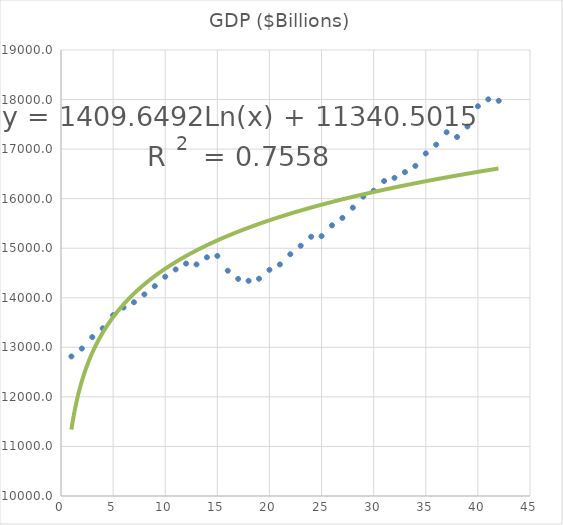
| Category | GDP ($Billions) |
|---|---|
| 1.0 | 12816.2 |
| 2.0 | 12975.7 |
| 3.0 | 13206.5 |
| 4.0 | 13383.3 |
| 5.0 | 13649.8 |
| 6.0 | 13802.9 |
| 7.0 | 13910.5 |
| 8.0 | 14068.4 |
| 9.0 | 14235 |
| 10.0 | 14424.5 |
| 11.0 | 14571.9 |
| 12.0 | 14690 |
| 13.0 | 14672.9 |
| 14.0 | 14817.1 |
| 15.0 | 14844.3 |
| 16.0 | 14546.7 |
| 17.0 | 14381.2 |
| 18.0 | 14342.1 |
| 19.0 | 14384.4 |
| 20.0 | 14564.1 |
| 21.0 | 14672.5 |
| 22.0 | 14879.2 |
| 23.0 | 15049.8 |
| 24.0 | 15231.7 |
| 25.0 | 15242.9 |
| 26.0 | 15461.9 |
| 27.0 | 15611.8 |
| 28.0 | 15818.7 |
| 29.0 | 16041.6 |
| 30.0 | 16160.4 |
| 31.0 | 16356 |
| 32.0 | 16420.3 |
| 33.0 | 16535.3 |
| 34.0 | 16661 |
| 35.0 | 16912.9 |
| 36.0 | 17089.6 |
| 37.0 | 17340 |
| 38.0 | 17245 |
| 39.0 | 17456 |
| 40.0 | 17865 |
| 41.0 | 18004 |
| 42.0 | 17975 |